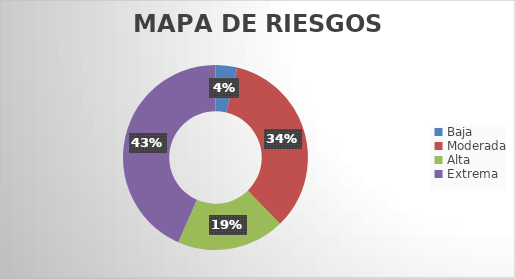
| Category | Series 0 |
|---|---|
| Baja | 0.038 |
| Moderada | 0.34 |
| Alta | 0.189 |
| Extrema | 0.434 |